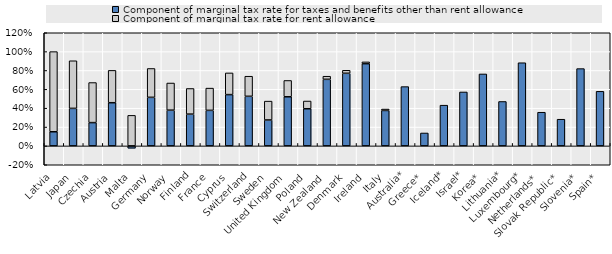
| Category | Component of marginal tax rate for taxes and benefits other than rent allowance | Component of marginal tax rate for rent allowance |
|---|---|---|
| Latvia | 0.15 | 0.85 |
| Japan | 0.398 | 0.505 |
| Czechia | 0.247 | 0.425 |
| Austria | 0.458 | 0.343 |
| Malta | -0.025 | 0.324 |
| Germany | 0.515 | 0.306 |
| Norway | 0.379 | 0.288 |
| Finland | 0.337 | 0.272 |
| France | 0.377 | 0.236 |
| Cyprus | 0.544 | 0.23 |
| Switzerland | 0.526 | 0.213 |
| Sweden | 0.275 | 0.2 |
| United Kingdom | 0.521 | 0.173 |
| Poland | 0.394 | 0.082 |
| New Zealand | 0.706 | 0.033 |
| Denmark | 0.77 | 0.032 |
| Ireland | 0.872 | 0.019 |
| Italy | 0.376 | 0.015 |
| Australia* | 0.629 | 0 |
| Greece* | 0.137 | 0 |
| Iceland* | 0.432 | 0 |
| Israel* | 0.572 | 0 |
| Korea* | 0.763 | 0 |
| Lithuania* | 0.471 | 0 |
| Luxembourg* | 0.882 | 0 |
| Netherlands* | 0.357 | 0 |
| Slovak Republic* | 0.283 | 0 |
| Slovenia* | 0.82 | 0 |
| Spain* | 0.579 | 0 |